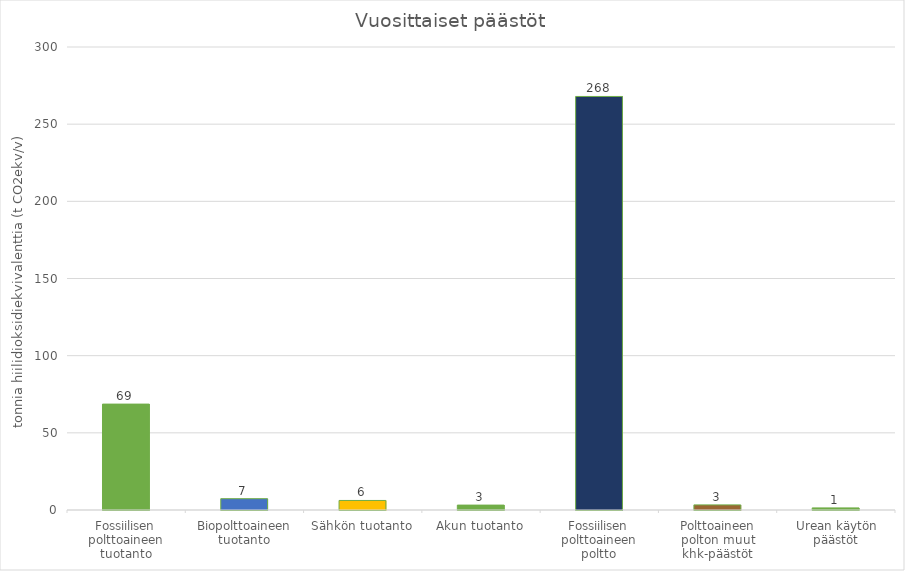
| Category | Vuosittaiset päästöt |
|---|---|
| Fossiilisen polttoaineen tuotanto | 68.615 |
| Biopolttoaineen tuotanto | 7.333 |
| Sähkön tuotanto | 6.182 |
| Akun tuotanto | 3.175 |
| Fossiilisen polttoaineen poltto | 267.956 |
| Polttoaineen polton muut khk-päästöt | 3.317 |
| Urean käytön päästöt | 1.357 |